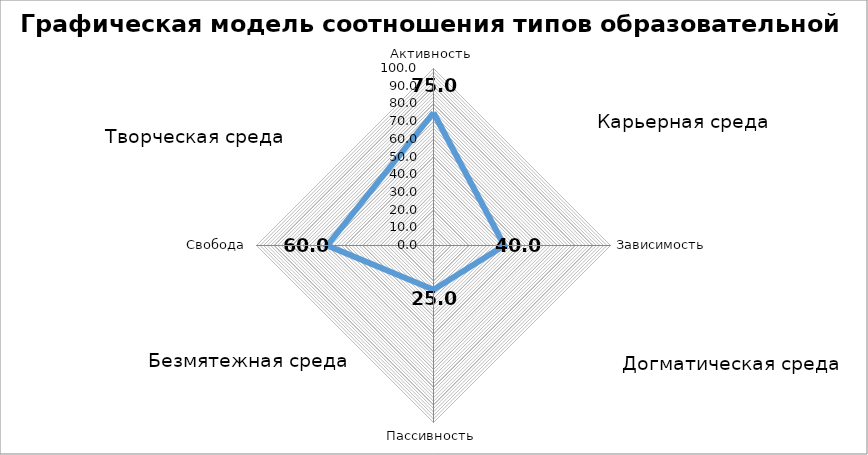
| Category | Графическая модель соотношения типов образовательной среды |
|---|---|
| Активность | 75 |
| Зависимость | 40 |
| Пассивность | 25 |
| Свобода | 60 |